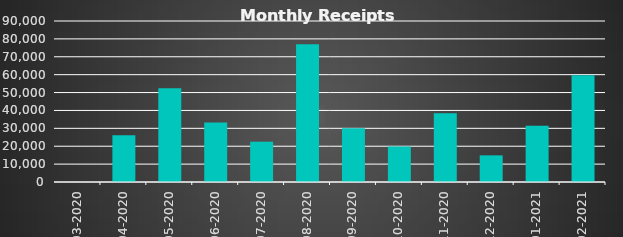
| Category |  Receipts  |
|---|---|
| 2020-03-31 | 0 |
| 2020-04-30 | 26200 |
| 2020-05-31 | 52338 |
| 2020-06-30 | 33220 |
| 2020-07-31 | 22520 |
| 2020-08-31 | 77000 |
| 2020-09-30 | 30000 |
| 2020-10-31 | 19850 |
| 2020-11-30 | 38430 |
| 2020-12-31 | 14900 |
| 2021-01-31 | 31490 |
| 2021-02-28 | 59617 |